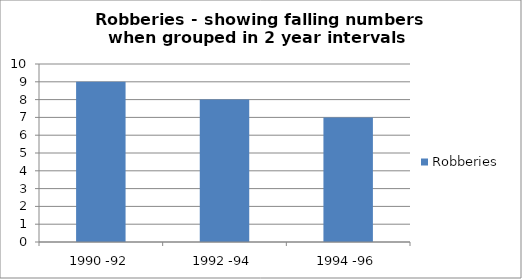
| Category | Robberies  |
|---|---|
| 1990 -92 | 9 |
| 1992 -94 | 8 |
| 1994 -96 | 7 |